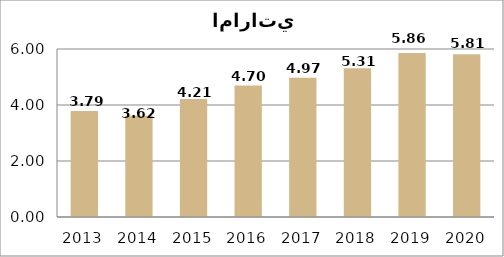
| Category | Series 0 |
|---|---|
| 2013.0 | 3.79 |
| 2014.0 | 3.62 |
| 2015.0 | 4.21 |
| 2016.0 | 4.7 |
| 2017.0 | 4.97 |
| 2018.0 | 5.31 |
| 2019.0 | 5.86 |
| 2020.0 | 5.81 |